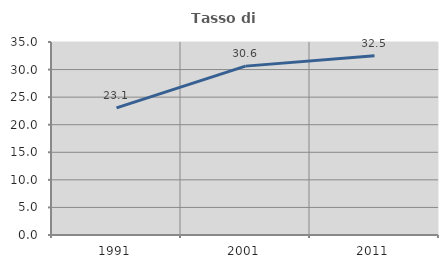
| Category | Tasso di occupazione   |
|---|---|
| 1991.0 | 23.053 |
| 2001.0 | 30.626 |
| 2011.0 | 32.496 |